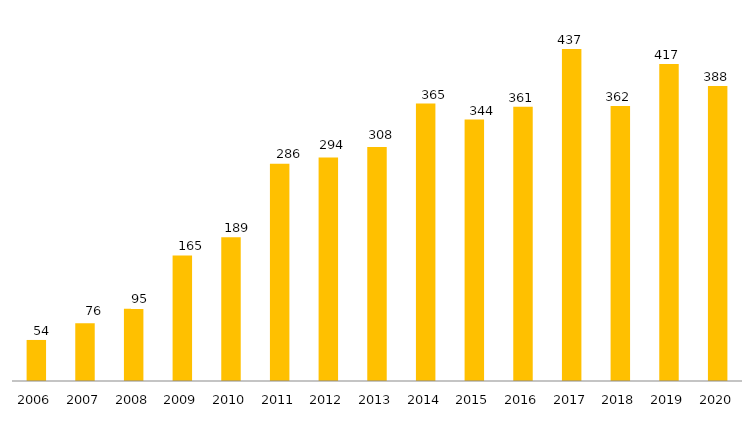
| Category | Programa |
|---|---|
| 2006.0 | 54 |
| 2007.0 | 76 |
| 2008.0 | 95 |
| 2009.0 | 165 |
| 2010.0 | 189 |
| 2011.0 | 286 |
| 2012.0 | 294 |
| 2013.0 | 308 |
| 2014.0 | 365 |
| 2015.0 | 344 |
| 2016.0 | 361 |
| 2017.0 | 437 |
| 2018.0 | 362 |
| 2019.0 | 417 |
| 2020.0 | 388 |